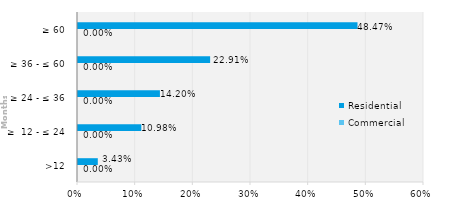
| Category | Commercial | Residential |
|---|---|---|
| >12 | 0 | 0.034 |
| ≥  12 - ≤ 24 | 0 | 0.11 |
| ≥ 24 - ≤ 36 | 0 | 0.142 |
| ≥ 36 - ≤ 60 | 0 | 0.229 |
| ≥ 60 | 0 | 0.485 |